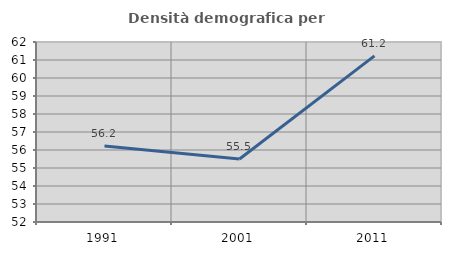
| Category | Densità demografica |
|---|---|
| 1991.0 | 56.218 |
| 2001.0 | 55.502 |
| 2011.0 | 61.231 |